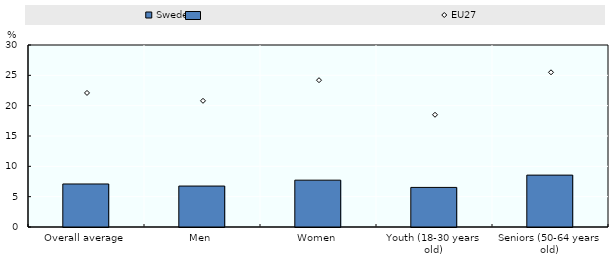
| Category | Sweden |
|---|---|
| Overall average | 7.092 |
| Men | 6.749 |
| Women | 7.72 |
| Youth (18-30 years old) | 6.526 |
| Seniors (50-64 years old) | 8.553 |